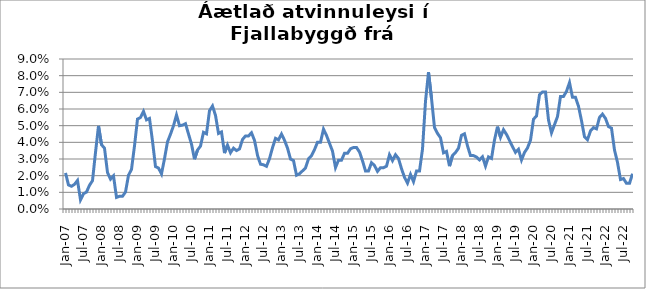
| Category | Series 0 |
|---|---|
| jan.07 | 0.022 |
| feb.07 | 0.014 |
| mar.07 | 0.014 |
| apr.07 | 0.015 |
| maí.07 | 0.017 |
| jún.07 | 0.005 |
| júl.07 | 0.009 |
| ágú.07 | 0.01 |
| sep.07 | 0.014 |
| okt.07 | 0.017 |
| nóv.07 | 0.034 |
| des.07 | 0.05 |
| jan.08 | 0.039 |
| feb.08 | 0.036 |
| mar.08 | 0.022 |
| apr.08 | 0.018 |
| maí.08 | 0.02 |
| jún.08 | 0.007 |
| júl.08 | 0.008 |
| ágú.08 | 0.008 |
| sep.08 | 0.01 |
| okt.08 | 0.02 |
| nóv.08 | 0.024 |
| des.08 | 0.038 |
| jan.09 | 0.054 |
| feb.09 | 0.055 |
| mar.09 | 0.059 |
| apr.09 | 0.053 |
| maí.09 | 0.054 |
| jún.09 | 0.041 |
| júl.09 | 0.025 |
| ágú.09 | 0.025 |
| sep.09 | 0.021 |
| okt.09 | 0.03 |
| nóv.09 | 0.04 |
| des.09 | 0.045 |
| jan.10 | 0.05 |
| feb.10 | 0.056 |
| mar.10 | 0.05 |
| apr.10 | 0.05 |
| maí.10 | 0.051 |
| jún.10 | 0.045 |
| júl.10 | 0.039 |
| ágú.10 | 0.03 |
| sep.10 | 0.035 |
| okt.10 | 0.038 |
| nóv.10 | 0.046 |
| des.10 | 0.045 |
| jan.11 | 0.059 |
| feb.11 | 0.062 |
| mar.11 | 0.056 |
| apr.11 | 0.045 |
| maí.11 | 0.046 |
| jún.11 | 0.034 |
| júl.11 | 0.038 |
| ágú.11 | 0.034 |
| sep.11 | 0.036 |
| okt.11 | 0.035 |
| nóv.11 | 0.036 |
| des.11 | 0.042 |
| jan.12 | 0.044 |
| feb.12 | 0.044 |
| mar.12 | 0.046 |
| apr.12 | 0.041 |
| maí.12 | 0.032 |
| jún.12 | 0.027 |
| júl.12 | 0.027 |
| ágú.12 | 0.026 |
| sep.12 | 0.03 |
| okt.12 | 0.037 |
| nóv.12 | 0.042 |
| des.12 | 0.041 |
| jan.13 | 0.045 |
| feb.13 | 0.041 |
| mar.13 | 0.037 |
| apr.13 | 0.03 |
| maí.13 | 0.029 |
| jún.13 | 0.02 |
| júl.13 | 0.021 |
| ágú.13 | 0.023 |
| sep.13 | 0.025 |
| okt.13 | 0.03 |
| nóv.13 | 0.032 |
| des.13 | 0.036 |
| jan.14 | 0.04 |
| feb.14 | 0.04 |
| mar.14 | 0.048 |
| apr.14 | 0.044 |
| maí.14 | 0.039 |
| jún.14 | 0.035 |
| júl.14 | 0.025 |
| ágú.14 | 0.029 |
| sep.14 | 0.029 |
| okt.14 | 0.033 |
| nóv.14 | 0.033 |
| des.14 | 0.036 |
| jan.15 | 0.037 |
| feb.15 | 0.037 |
| mar.15 | 0.034 |
| apr.15 | 0.029 |
| maí.15 | 0.023 |
| jún.15 | 0.023 |
| júl.15 | 0.028 |
| ágú.15 | 0.026 |
| sep.15 | 0.023 |
| okt.15 | 0.025 |
| nóv.15 | 0.025 |
| des.15 | 0.026 |
| jan.16 | 0.033 |
| feb.16 | 0.029 |
| mar.16 | 0.033 |
| apr.16 | 0.03 |
| maí.16 | 0.024 |
| jún.16 | 0.019 |
| júl.16 | 0.016 |
| ágú.16 | 0.021 |
| sep.16 | 0.016 |
| okt.16 | 0.023 |
| nóv.16 | 0.023 |
| des.16 | 0.036 |
| jan.17 | 0.065 |
| feb.17 | 0.082 |
| mar.17 | 0.066 |
| apr.17 | 0.049 |
| maí.17 | 0.045 |
| jún.17 | 0.043 |
| júl.17 | 0.034 |
| ágú.17 | 0.035 |
| sep.17 | 0.026 |
| okt.17 | 0.032 |
| nóv.17 | 0.034 |
| des.17 | 0.037 |
| jan.18 | 0.044 |
| feb.18 | 0.045 |
| mar.18 | 0.038 |
| apr.18 | 0.032 |
| maí.18 | 0.032 |
| jún.18 | 0.031 |
| júl.18 | 0.029 |
| ágú.18 | 0.031 |
| sep.18 | 0.026 |
| okt.18 | 0.031 |
| nóv.18 | 0.03 |
| des.18 | 0.041 |
| jan.19 | 0.049 |
| feb.19 | 0.043 |
| mar.19 | 0.048 |
| apr.19 | 0.045 |
| maí.19 | 0.041 |
| jún.19 | 0.037 |
| júl.19 | 0.034 |
| ágú.19 | 0.036 |
| sep.19 | 0.029 |
| okt.19 | 0.034 |
| nóv.19 | 0.037 |
| des.19 | 0.041 |
| jan.20 | 0.054 |
| feb.20 | 0.056 |
| mar. 20*** | 0.069 |
| apr.20 | 0.07 |
| maí.20 | 0.07 |
| jún.20 | 0.053 |
| júl.20 | 0.046 |
| ágú.20 | 0.051 |
| sep.20 | 0.055 |
| okt.20 | 0.068 |
| nóv.20 | 0.068 |
| des.20 | 0.071 |
| jan.21 | 0.076 |
| feb.21 | 0.067 |
| mar.21 | 0.067 |
| apr.21 | 0.062 |
| maí.21 | 0.053 |
| jún.21 | 0.043 |
| júl.21 | 0.042 |
| ágú.21 | 0.047 |
| sep.21 | 0.049 |
| okt.21 | 0.048 |
| nóv.21 | 0.055 |
| des.21 | 0.057 |
| jan.22 | 0.054 |
| feb.22 | 0.049 |
| mar.22 | 0.048 |
| apr.22 | 0.035 |
| maí.22 | 0.028 |
| jún.22 | 0.018 |
| júl.22 | 0.018 |
| ágú.22 | 0.015 |
| sep.22 | 0.015 |
| okt.22 | 0.021 |